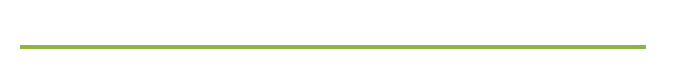
| Category | Documents |
|---|---|
| 0 | 0 |